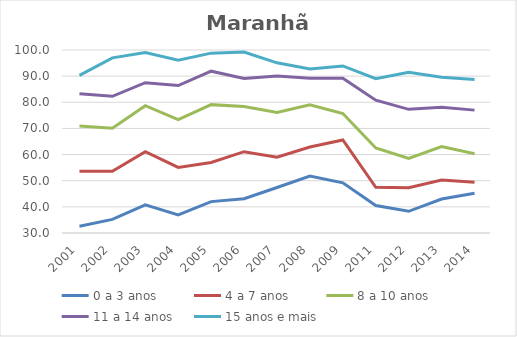
| Category | 0 a 3 anos | 4 a 7 anos | 8 a 10 anos | 11 a 14 anos | 15 anos e mais |
|---|---|---|---|---|---|
| 2001.0 | 32.6 | 53.6 | 70.9 | 83.3 | 90.3 |
| 2002.0 | 35.2 | 53.6 | 70.1 | 82.3 | 97 |
| 2003.0 | 40.8 | 61.1 | 78.7 | 87.5 | 99 |
| 2004.0 | 36.9 | 55.1 | 73.4 | 86.4 | 96.1 |
| 2005.0 | 42 | 57 | 79.1 | 91.9 | 98.8 |
| 2006.0 | 43.1 | 61.1 | 78.4 | 89.1 | 99.2 |
| 2007.0 | 47.4 | 59 | 76.1 | 90.1 | 95.1 |
| 2008.0 | 51.8 | 62.9 | 79 | 89.2 | 92.7 |
| 2009.0 | 49.2 | 65.6 | 75.7 | 89.2 | 93.9 |
| 2011.0 | 40.5 | 47.5 | 62.5 | 80.8 | 89 |
| 2012.0 | 38.3 | 47.3 | 58.5 | 77.3 | 91.5 |
| 2013.0 | 43 | 50.3 | 63.1 | 78.1 | 89.6 |
| 2014.0 | 45.2 | 49.4 | 60.3 | 77 | 88.7 |